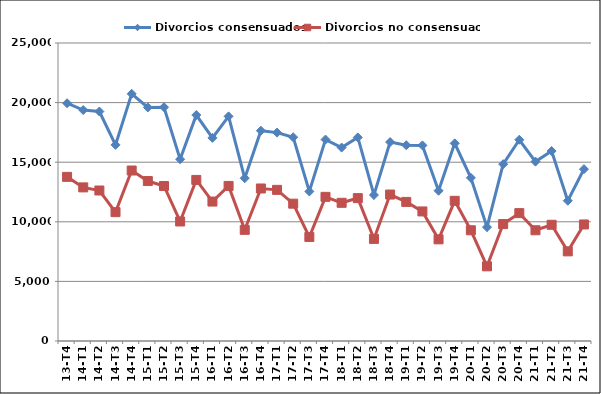
| Category | Divorcios consensuados | Divorcios no consensuados |
|---|---|---|
| 13-T4 | 19948 | 13769 |
| 14-T1 | 19376 | 12887 |
| 14-T2 | 19251 | 12625 |
| 14-T3 | 16454 | 10812 |
| 14-T4 | 20739 | 14302 |
| 15-T1 | 19595 | 13420 |
| 15-T2 | 19612 | 13004 |
| 15-T3 | 15249 | 10027 |
| 15-T4 | 18958 | 13512 |
| 16-T1 | 17041 | 11699 |
| 16-T2 | 18847 | 13011 |
| 16-T3 | 13660 | 9325 |
| 16-T4 | 17641 | 12795 |
| 17-T1 | 17483 | 12679 |
| 17-T2 | 17095 | 11520 |
| 17-T3 | 12545 | 8727 |
| 17-T4 | 16901 | 12093 |
| 18-T1 | 16226 | 11594 |
| 18-T2 | 17077 | 11986 |
| 18-T3 | 12249 | 8566 |
| 18-T4 | 16689 | 12287 |
| 19-T1 | 16423 | 11668 |
| 19-T2 | 16409 | 10869 |
| 19-T3 | 12607 | 8528 |
| 19-T4 | 16581 | 11761 |
| 20-T1 | 13690 | 9290 |
| 20-T2 | 9552 | 6264 |
| 20-T3 | 14835 | 9809 |
| 20-T4 | 16883 | 10727 |
| 21-T1 | 15048 | 9290 |
| 21-T2 | 15937 | 9750 |
| 21-T3 | 11767 | 7520 |
| 21-T4 | 14416 | 9777 |